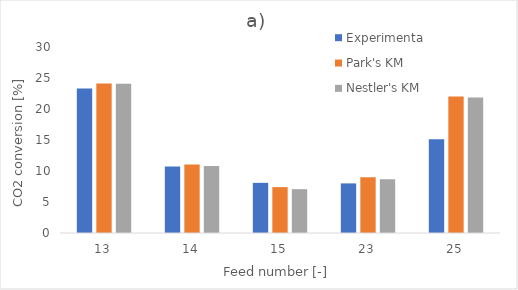
| Category | Experimental | Park's KM | Nestler's KM |
|---|---|---|---|
| 13.0 | 23.32 | 24.1 | 24.06 |
| 14.0 | 10.73 | 11.03 | 10.81 |
| 15.0 | 8.09 | 7.4 | 7.07 |
| 23.0 | 8 | 8.99 | 8.65 |
| 25.0 | 15.11 | 22.02 | 21.84 |